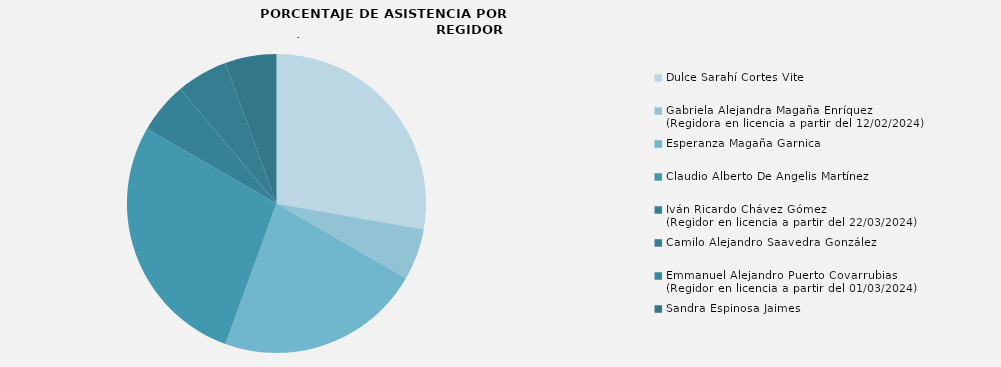
| Category | Series 0 |
|---|---|
| Dulce Sarahí Cortes Vite  | 100 |
| Gabriela Alejandra Magaña Enríquez
(Regidora en licencia a partir del 12/02/2024) | 20 |
| Esperanza Magaña Garnica | 80 |
| Claudio Alberto De Angelis Martínez | 100 |
| Iván Ricardo Chávez Gómez
(Regidor en licencia a partir del 22/03/2024) | 20 |
| Camilo Alejandro Saavedra González | 20 |
| Emmanuel Alejandro Puerto Covarrubias
(Regidor en licencia a partir del 01/03/2024) | 0 |
| Sandra Espinosa Jaimes | 20 |